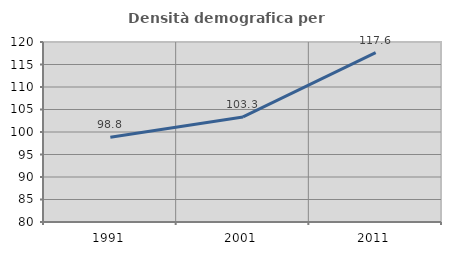
| Category | Densità demografica |
|---|---|
| 1991.0 | 98.833 |
| 2001.0 | 103.343 |
| 2011.0 | 117.623 |